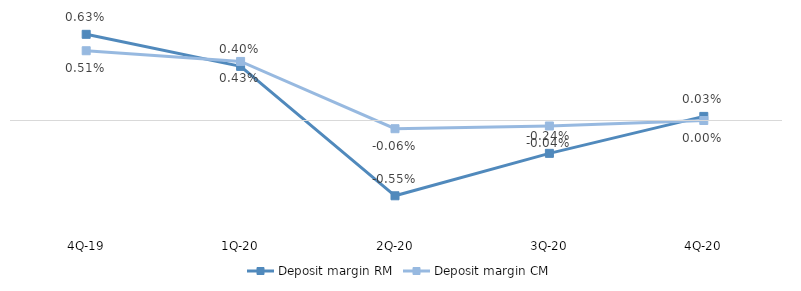
| Category | Deposit margin RM | Deposit margin CM |
|---|---|---|
| 4Q-20 | 0 | 0 |
| 3Q-20 | -0.002 | 0 |
| 2Q-20 | -0.006 | -0.001 |
| 1Q-20 | 0.004 | 0.004 |
| 4Q-19 | 0.006 | 0.005 |